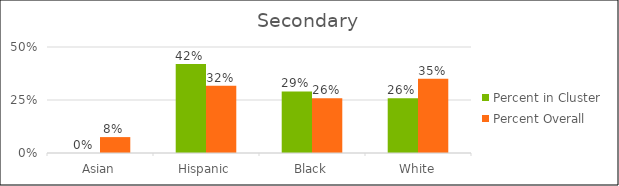
| Category | Percent in Cluster | Percent Overall |
|---|---|---|
| Asian | 0 | 0.075 |
| Hispanic | 0.419 | 0.317 |
| Black | 0.29 | 0.258 |
| White | 0.258 | 0.35 |